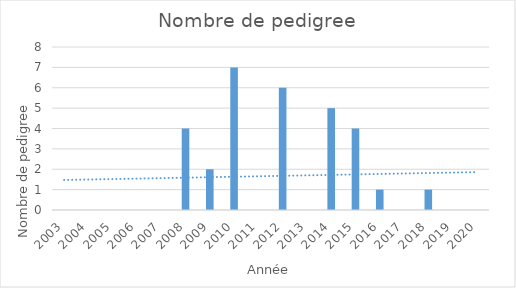
| Category | Series 0 |
|---|---|
| 2003.0 | 0 |
| 2004.0 | 0 |
| 2005.0 | 0 |
| 2006.0 | 0 |
| 2007.0 | 0 |
| 2008.0 | 4 |
| 2009.0 | 2 |
| 2010.0 | 7 |
| 2011.0 | 0 |
| 2012.0 | 6 |
| 2013.0 | 0 |
| 2014.0 | 5 |
| 2015.0 | 4 |
| 2016.0 | 1 |
| 2017.0 | 0 |
| 2018.0 | 1 |
| 2019.0 | 0 |
| 2020.0 | 0 |